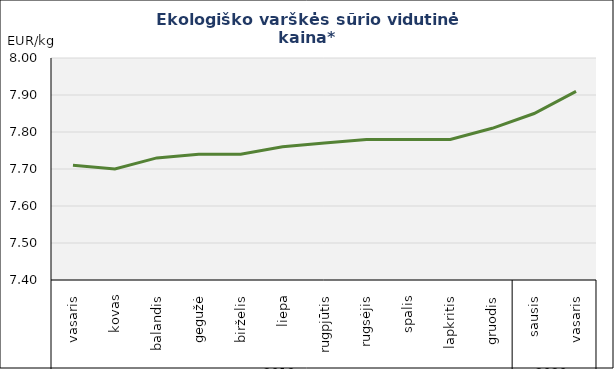
| Category | Varškės sūris |
|---|---|
| 0 | 7.71 |
| 1 | 7.7 |
| 2 | 7.73 |
| 3 | 7.74 |
| 4 | 7.74 |
| 5 | 7.76 |
| 6 | 7.77 |
| 7 | 7.78 |
| 8 | 7.78 |
| 9 | 7.78 |
| 10 | 7.81 |
| 11 | 7.85 |
| 12 | 7.91 |